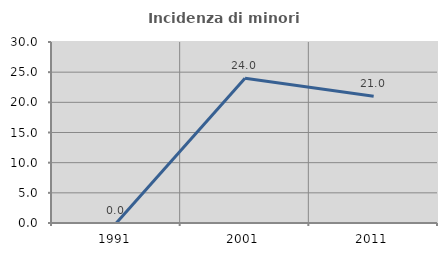
| Category | Incidenza di minori stranieri |
|---|---|
| 1991.0 | 0 |
| 2001.0 | 24 |
| 2011.0 | 21 |